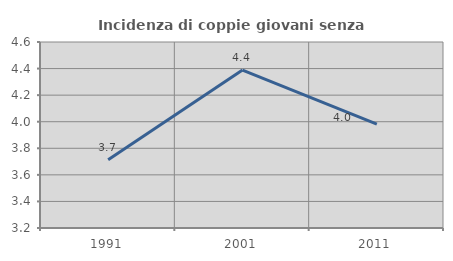
| Category | Incidenza di coppie giovani senza figli |
|---|---|
| 1991.0 | 3.714 |
| 2001.0 | 4.389 |
| 2011.0 | 3.982 |